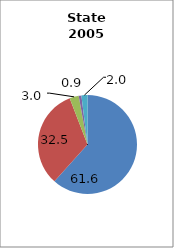
| Category | Arkansas |
|---|---|
| White | 61.634 |
| Black | 32.51 |
| Hispanic | 2.998 |
| Two or More Races | 0.883 |
| All Other1 | 1.975 |